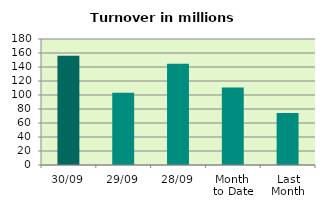
| Category | Series 0 |
|---|---|
| 30/09 | 156.083 |
| 29/09 | 103.253 |
| 28/09 | 144.777 |
| Month 
to Date | 110.611 |
| Last
Month | 74.221 |